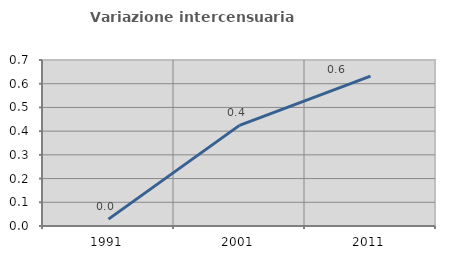
| Category | Variazione intercensuaria annua |
|---|---|
| 1991.0 | 0.029 |
| 2001.0 | 0.424 |
| 2011.0 | 0.632 |